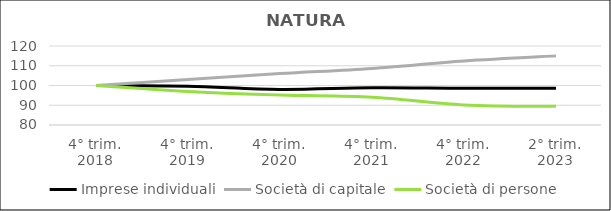
| Category | Imprese individuali | Società di capitale | Società di persone |
|---|---|---|---|
| 4° trim.
2018 | 100 | 100 | 100 |
| 4° trim.
2019 | 99.573 | 103.065 | 97.006 |
| 4° trim.
2020 | 98.035 | 106.033 | 95.134 |
| 4° trim.
2021 | 98.871 | 108.655 | 94.066 |
| 4° trim.
2022 | 98.631 | 112.396 | 90.182 |
| 2° trim.
2023 | 98.639 | 115.001 | 89.449 |